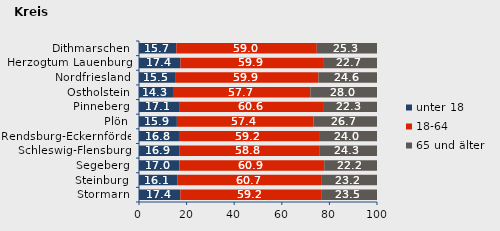
| Category | unter 18 | 18-64 | 65 und älter |
|---|---|---|---|
| Stormarn | 17.376 | 59.166 | 23.458 |
| Steinburg | 16.085 | 60.743 | 23.172 |
| Segeberg | 16.988 | 60.85 | 22.161 |
| Schleswig-Flensburg | 16.881 | 58.821 | 24.297 |
| Rendsburg-Eckernförde | 16.801 | 59.223 | 23.977 |
| Plön | 15.919 | 57.424 | 26.657 |
| Pinneberg | 17.131 | 60.572 | 22.297 |
| Ostholstein | 14.278 | 57.712 | 28.01 |
| Nordfriesland | 15.453 | 59.939 | 24.608 |
| Herzogtum Lauenburg | 17.404 | 59.936 | 22.66 |
| Dithmarschen | 15.682 | 59.023 | 25.295 |